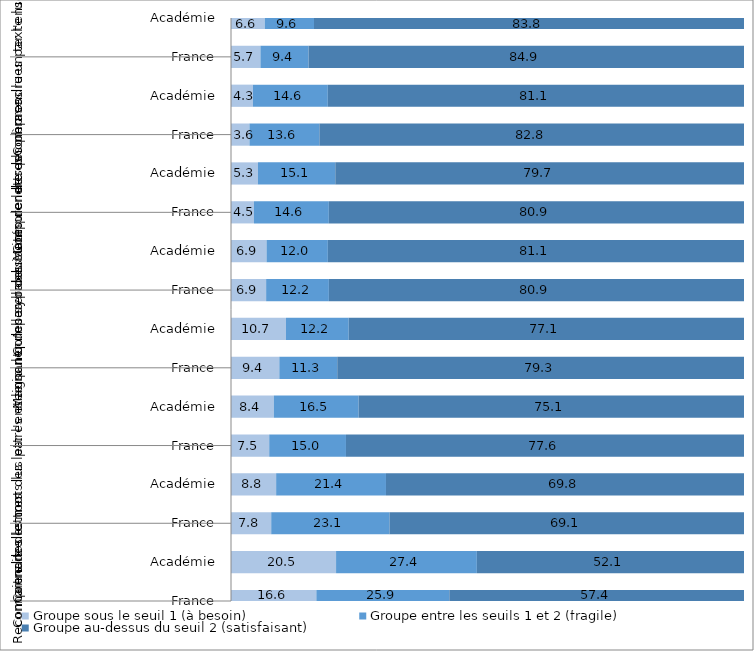
| Category | Groupe sous le seuil 1 (à besoin) | Groupe entre les seuils 1 et 2 (fragile) | Groupe au-dessus du seuil 2 (satisfaisant) |
|---|---|---|---|
| 0 | 16.64 | 25.92 | 57.44 |
| 1 | 20.48 | 27.44 | 52.07 |
| 2 | 7.84 | 23.06 | 69.11 |
| 3 | 8.8 | 21.41 | 69.79 |
| 4 | 7.45 | 14.96 | 77.58 |
| 5 | 8.35 | 16.53 | 75.11 |
| 6 | 9.42 | 11.29 | 79.28 |
| 7 | 10.71 | 12.24 | 77.05 |
| 8 | 6.85 | 12.23 | 80.92 |
| 9 | 6.93 | 11.95 | 81.12 |
| 10 | 4.48 | 14.59 | 80.93 |
| 11 | 5.25 | 15.08 | 79.67 |
| 12 | 3.6 | 13.63 | 82.77 |
| 13 | 4.28 | 14.59 | 81.12 |
| 14 | 5.74 | 9.38 | 84.88 |
| 15 | 6.58 | 9.6 | 83.82 |